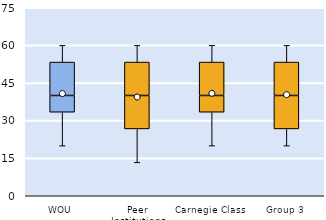
| Category | 25th | 50th | 75th |
|---|---|---|---|
| WOU | 33.333 | 6.667 | 13.333 |
| Peer Institutions | 26.667 | 13.333 | 13.333 |
| Carnegie Class | 33.333 | 6.667 | 13.333 |
| Group 3 | 26.667 | 13.333 | 13.333 |